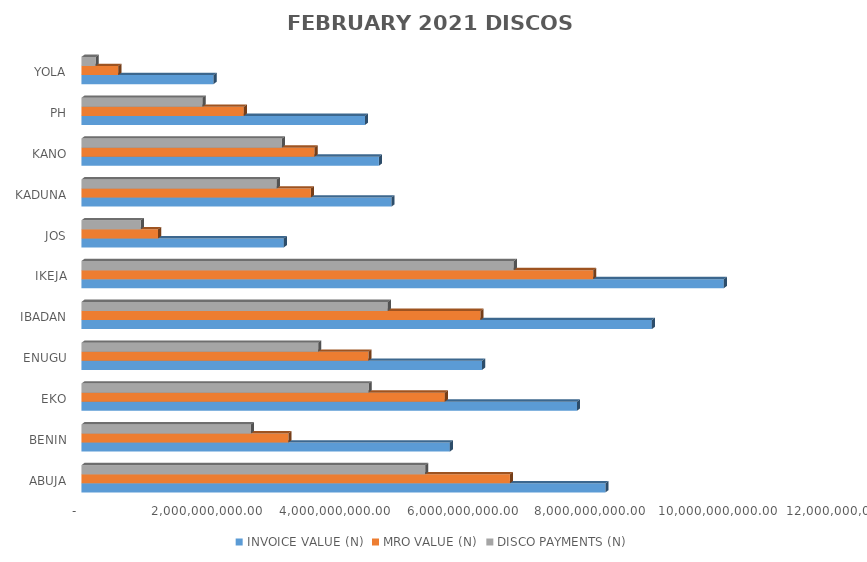
| Category | INVOICE VALUE (N) | MRO VALUE (N) | DISCO PAYMENTS (N) |
|---|---|---|---|
| ABUJA | 8208969402.97 | 6712474280.808 | 5385083928.35 |
| BENIN | 5771549262.528 | 3243033530.615 | 2655489815.69 |
| EKO | 7763525715.338 | 5692993407.058 | 4498963152.04 |
| ENUGU | 6275535746.469 | 4495166255.195 | 3709469179.74 |
| IBADAN | 8935738512.447 | 6251442663.308 | 4800278728.89 |
| IKEJA | 10063174065.103 | 8016324460.261 | 6773522463.22 |
| JOS | 3170869292.274 | 1201125287.913 | 931284311.14 |
| KADUNA | 4857475815.781 | 3594532103.678 | 3061181259.11 |
| KANO | 4659707797.006 | 3652278971.293 | 3140643055.18 |
| PH | 4442072851.828 | 2543975122.242 | 1897209315.02 |
| YOLA | 2069495463.262 | 578010082.889 | 222310114.87 |